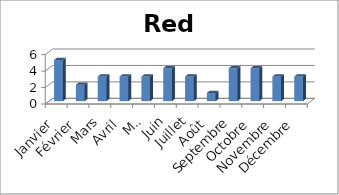
| Category | Red Daron |
|---|---|
| Janvier | 5 |
| Février | 2 |
| Mars | 3 |
| Avril | 3 |
| Mai | 3 |
| Juin | 4 |
| Juillet | 3 |
| Août | 1 |
| Septembre | 4 |
| Octobre | 4 |
| Novembre | 3 |
| Décembre | 3 |